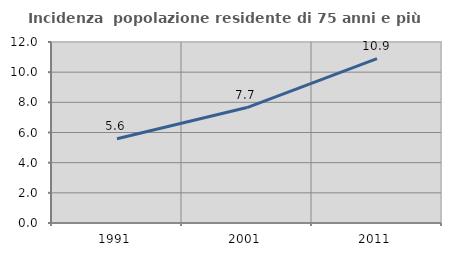
| Category | Incidenza  popolazione residente di 75 anni e più |
|---|---|
| 1991.0 | 5.587 |
| 2001.0 | 7.653 |
| 2011.0 | 10.902 |